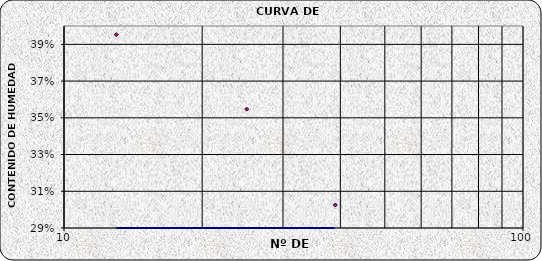
| Category | Series 0 |
|---|---|
| 39.0 | 0.303 |
| 25.0 | 0.355 |
| 13.0 | 0.395 |